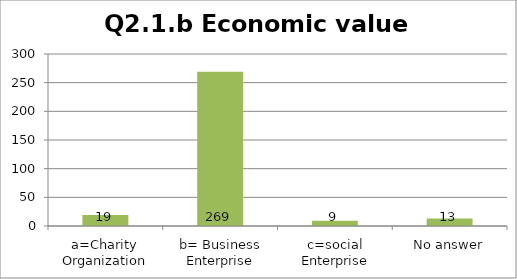
| Category | Q2.1.b Economic value creation |
|---|---|
| a=Charity Organization | 19 |
| b= Business Enterprise | 269 |
| c=social Enterprise | 9 |
| No answer | 13 |